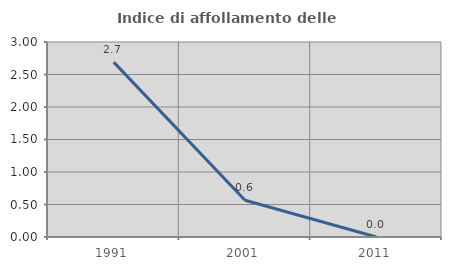
| Category | Indice di affollamento delle abitazioni  |
|---|---|
| 1991.0 | 2.691 |
| 2001.0 | 0.565 |
| 2011.0 | 0 |